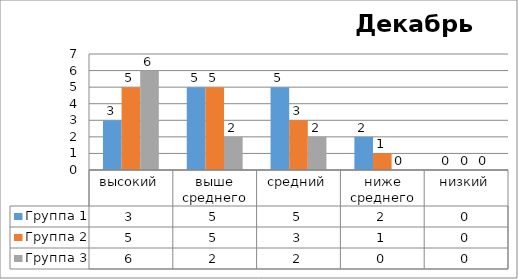
| Category | Группа 1 | Группа 2 | Группа 3 |
|---|---|---|---|
| высокий | 3 | 5 | 6 |
| выше среднего | 5 | 5 | 2 |
| средний | 5 | 3 | 2 |
| ниже среднего | 2 | 1 | 0 |
| низкий | 0 | 0 | 0 |